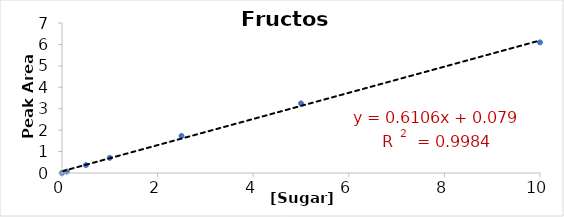
| Category | Series 0 |
|---|---|
| 0.0 | 0 |
| 0.1 | 0.066 |
| 0.5 | 0.369 |
| 1.0 | 0.707 |
| 2.5 | 1.73 |
| 5.0 | 3.247 |
| 10.0 | 6.095 |